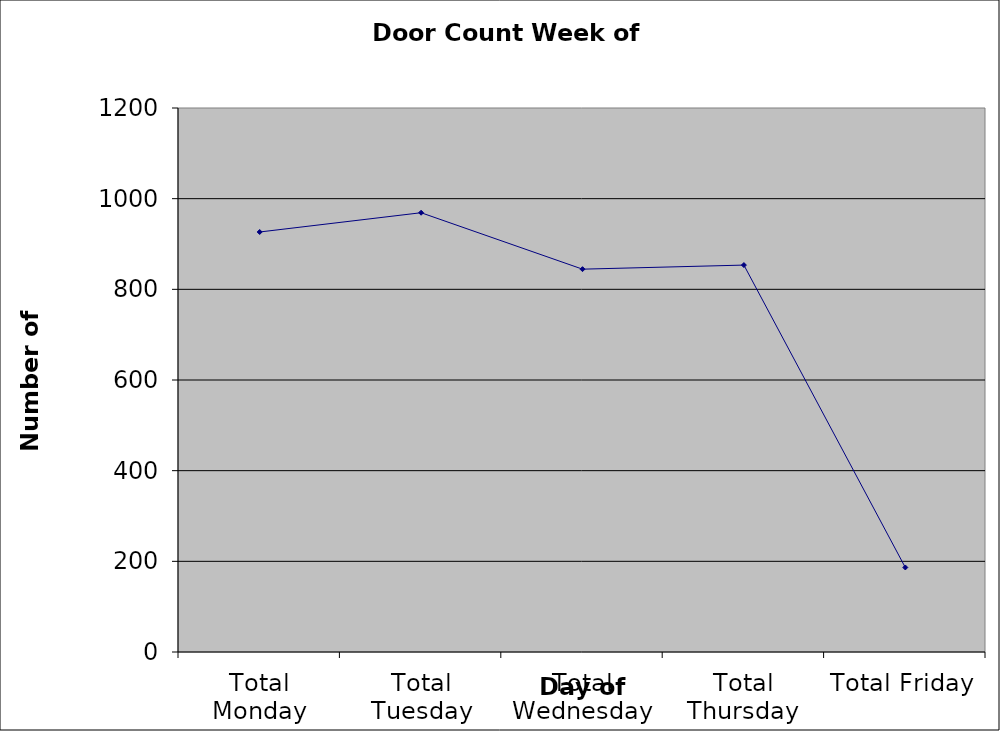
| Category | Series 0 |
|---|---|
| Total Monday | 926.5 |
| Total Tuesday | 969 |
| Total Wednesday | 844.5 |
| Total Thursday | 853.5 |
| Total Friday | 186.5 |